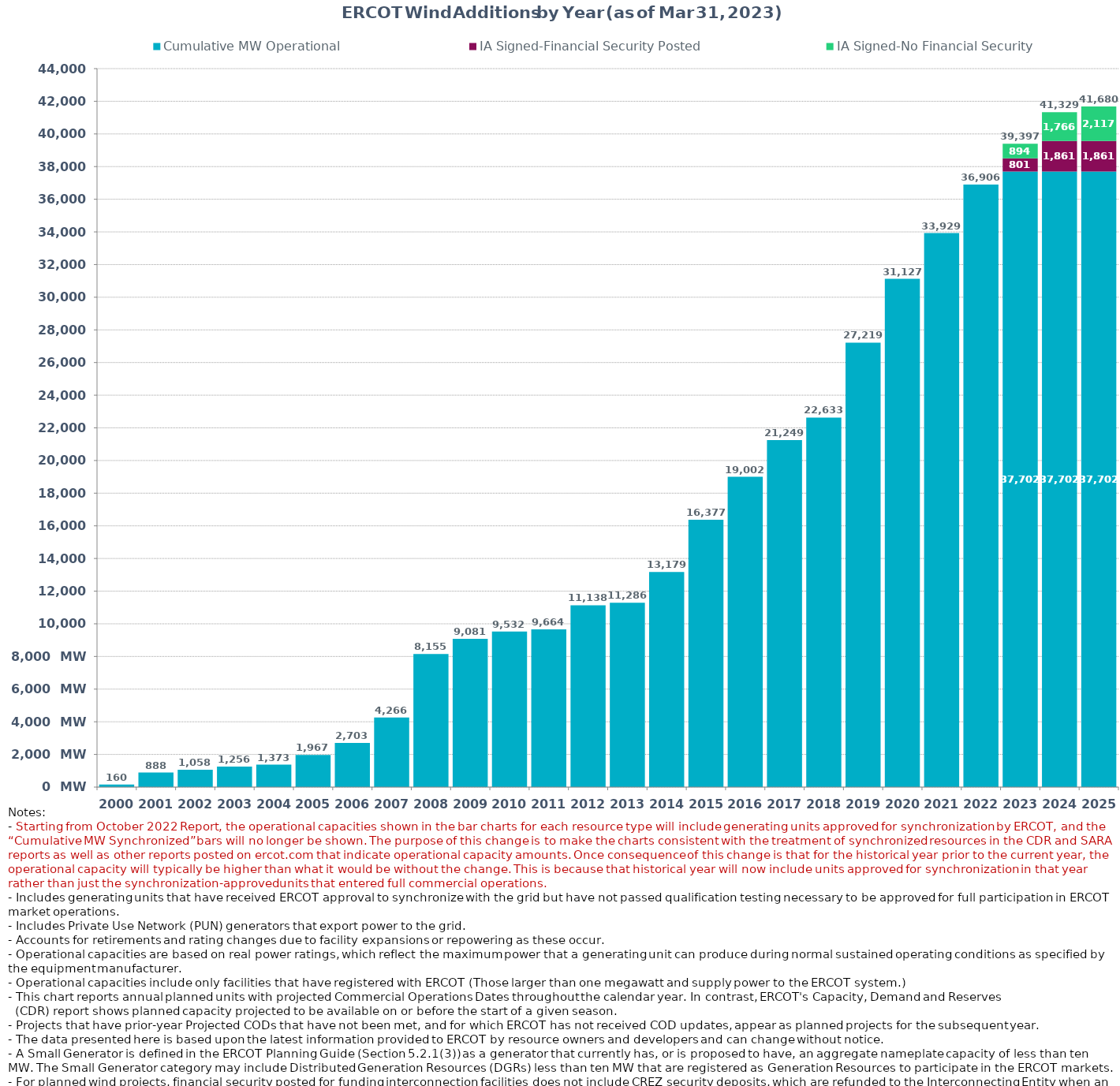
| Category | Cumulative MW Operational  | IA Signed-Financial Security Posted  | IA Signed-No Financial Security  | Other Planned | Cumulative Installed and Planned |
|---|---|---|---|---|---|
| 2000.0 | 160.37 | 0 | 0 | 0 | 160.37 |
| 2001.0 | 887.97 | 0 | 0 | 0 | 887.97 |
| 2002.0 | 1058.22 | 0 | 0 | 0 | 1058.22 |
| 2003.0 | 1255.72 | 0 | 0 | 0 | 1255.72 |
| 2004.0 | 1372.82 | 0 | 0 | 0 | 1372.82 |
| 2005.0 | 1967.04 | 0 | 0 | 0 | 1967.04 |
| 2006.0 | 2703.34 | 0 | 0 | 0 | 2703.34 |
| 2007.0 | 4266.36 | 0 | 0 | 0 | 4266.36 |
| 2008.0 | 8154.76 | 0 | 0 | 0 | 8154.76 |
| 2009.0 | 9080.78 | 0 | 0 | 0 | 9080.78 |
| 2010.0 | 9531.7 | 0 | 0 | 0 | 9531.7 |
| 2011.0 | 9663.7 | 0 | 0 | 0 | 9663.7 |
| 2012.0 | 11137.66 | 0 | 0 | 0 | 11137.66 |
| 2013.0 | 11286.26 | 0 | 0 | 0 | 11286.26 |
| 2014.0 | 13178.84 | 0 | 0 | 0 | 13178.84 |
| 2015.0 | 16376.53 | 0 | 0 | 0 | 16376.53 |
| 2016.0 | 19001.85 | 0 | 0 | 0 | 19001.85 |
| 2017.0 | 21248.99 | 0 | 0 | 0 | 21248.99 |
| 2018.0 | 22632.69 | 0 | 0 | 0 | 22632.69 |
| 2019.0 | 27219.34 | 0 | 0 | 0 | 27219.34 |
| 2020.0 | 31127.31 | 0 | 0 | 0 | 31127.31 |
| 2021.0 | 33928.91 | 0 | 0 | 0 | 33928.91 |
| 2022.0 | 36906.07 | 0 | 0 | 0 | 36906.07 |
| 2023.0 | 37702.33 | 800.52 | 894 | 0 | 39396.85 |
| 2024.0 | 37702.33 | 1861.26 | 1765.71 | 0 | 41329.3 |
| 2025.0 | 37702.33 | 1861.26 | 2116.71 | 0 | 41680.3 |